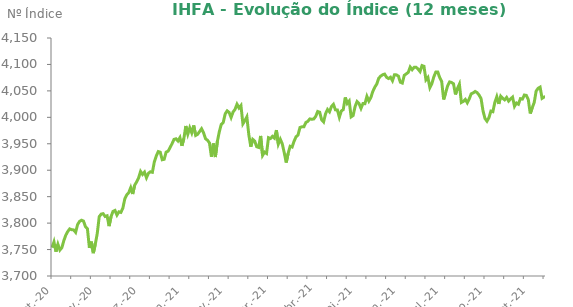
| Category | Series 0 |
|---|---|
| 2020-09-30 | 3753.64 |
| 2020-10-01 | 3764.5 |
| 2020-10-02 | 3745.97 |
| 2020-10-05 | 3760.02 |
| 2020-10-06 | 3748.99 |
| 2020-10-07 | 3753.5 |
| 2020-10-08 | 3766.65 |
| 2020-10-09 | 3777.19 |
| 2020-10-13 | 3784.1 |
| 2020-10-14 | 3789.08 |
| 2020-10-15 | 3787.5 |
| 2020-10-16 | 3787.18 |
| 2020-10-19 | 3782.57 |
| 2020-10-20 | 3797.23 |
| 2020-10-21 | 3803.26 |
| 2020-10-22 | 3805.46 |
| 2020-10-23 | 3803.83 |
| 2020-10-26 | 3793.41 |
| 2020-10-27 | 3789.23 |
| 2020-10-28 | 3753.16 |
| 2020-10-29 | 3765 |
| 2020-10-30 | 3743.2 |
| 2020-11-03 | 3760.2 |
| 2020-11-04 | 3780.52 |
| 2020-11-05 | 3812.25 |
| 2020-11-06 | 3817.11 |
| 2020-11-09 | 3817.77 |
| 2020-11-10 | 3812.47 |
| 2020-11-11 | 3813.86 |
| 2020-11-12 | 3794.28 |
| 2020-11-13 | 3812.36 |
| 2020-11-16 | 3822.16 |
| 2020-11-17 | 3824.03 |
| 2020-11-18 | 3815.25 |
| 2020-11-19 | 3821.41 |
| 2020-11-20 | 3820.26 |
| 2020-11-23 | 3828.39 |
| 2020-11-24 | 3845.88 |
| 2020-11-25 | 3853.47 |
| 2020-11-26 | 3857.65 |
| 2020-11-27 | 3867.12 |
| 2020-11-30 | 3855.05 |
| 2020-12-01 | 3871.75 |
| 2020-12-02 | 3877.88 |
| 2020-12-03 | 3885.5 |
| 2020-12-04 | 3897.62 |
| 2020-12-07 | 3892.04 |
| 2020-12-08 | 3896.42 |
| 2020-12-09 | 3885.78 |
| 2020-12-10 | 3894.3 |
| 2020-12-11 | 3897.04 |
| 2020-12-14 | 3896.11 |
| 2020-12-15 | 3915.91 |
| 2020-12-16 | 3927.07 |
| 2020-12-17 | 3935.34 |
| 2020-12-18 | 3934.05 |
| 2020-12-21 | 3919.86 |
| 2020-12-22 | 3920.69 |
| 2020-12-23 | 3934.3 |
| 2020-12-24 | 3936.01 |
| 2020-12-28 | 3942.95 |
| 2020-12-29 | 3950.19 |
| 2020-12-30 | 3958.34 |
| 2020-12-31 | 3959.42 |
| 2021-01-04 | 3955.28 |
| 2021-01-05 | 3961.68 |
| 2021-01-06 | 3946.08 |
| 2021-01-07 | 3959.91 |
| 2021-01-08 | 3983.61 |
| 2021-01-11 | 3968.18 |
| 2021-01-12 | 3980.22 |
| 2021-01-13 | 3970.68 |
| 2021-01-14 | 3984.72 |
| 2021-01-15 | 3965.79 |
| 2021-01-18 | 3967.89 |
| 2021-01-19 | 3973.23 |
| 2021-01-20 | 3978.48 |
| 2021-01-21 | 3971.03 |
| 2021-01-22 | 3959.66 |
| 2021-01-25 | 3956.69 |
| 2021-01-26 | 3951.66 |
| 2021-01-27 | 3925.52 |
| 2021-01-28 | 3950.5 |
| 2021-01-29 | 3924.94 |
| 2021-02-01 | 3953.82 |
| 2021-02-02 | 3972.6 |
| 2021-02-03 | 3986.69 |
| 2021-02-04 | 3990.2 |
| 2021-02-05 | 4006.56 |
| 2021-02-08 | 4012.28 |
| 2021-02-09 | 4009.25 |
| 2021-02-10 | 3999.73 |
| 2021-02-11 | 4010.06 |
| 2021-02-12 | 4015.12 |
| 2021-02-17 | 4024.82 |
| 2021-02-18 | 4017.66 |
| 2021-02-19 | 4022.34 |
| 2021-02-22 | 3987.76 |
| 2021-02-23 | 3993.76 |
| 2021-02-24 | 4000.86 |
| 2021-02-25 | 3967.23 |
| 2021-02-26 | 3944.47 |
| 2021-03-01 | 3958.31 |
| 2021-03-02 | 3955.07 |
| 2021-03-03 | 3944.44 |
| 2021-03-04 | 3943.1 |
| 2021-03-05 | 3964.81 |
| 2021-03-08 | 3928.07 |
| 2021-03-09 | 3934.21 |
| 2021-03-10 | 3931.67 |
| 2021-03-11 | 3961.52 |
| 2021-03-12 | 3959.95 |
| 2021-03-15 | 3963.95 |
| 2021-03-16 | 3960.68 |
| 2021-03-17 | 3975.84 |
| 2021-03-18 | 3949.49 |
| 2021-03-19 | 3958.61 |
| 2021-03-22 | 3949.93 |
| 2021-03-23 | 3933.15 |
| 2021-03-24 | 3914.5 |
| 2021-03-25 | 3931.89 |
| 2021-03-26 | 3945.28 |
| 2021-03-29 | 3943.87 |
| 2021-03-30 | 3954.78 |
| 2021-03-31 | 3963.24 |
| 2021-04-01 | 3966.52 |
| 2021-04-05 | 3980.85 |
| 2021-04-06 | 3982.14 |
| 2021-04-07 | 3982.23 |
| 2021-04-08 | 3990.34 |
| 2021-04-09 | 3992.5 |
| 2021-04-12 | 3997.03 |
| 2021-04-13 | 3996.38 |
| 2021-04-14 | 3996.89 |
| 2021-04-15 | 4001.89 |
| 2021-04-16 | 4011.06 |
| 2021-04-19 | 4009.7 |
| 2021-04-20 | 3995.43 |
| 2021-04-22 | 3991.36 |
| 2021-04-23 | 4006.88 |
| 2021-04-26 | 4014.86 |
| 2021-04-27 | 4010.42 |
| 2021-04-28 | 4020.49 |
| 2021-04-29 | 4024.6 |
| 2021-04-30 | 4014.13 |
| 2021-05-03 | 4013.92 |
| 2021-05-04 | 4000.09 |
| 2021-05-05 | 4012 |
| 2021-05-06 | 4014.61 |
| 2021-05-07 | 4037.62 |
| 2021-05-10 | 4026.17 |
| 2021-05-11 | 4030.82 |
| 2021-05-12 | 4000.86 |
| 2021-05-13 | 4003.37 |
| 2021-05-14 | 4020.47 |
| 2021-05-17 | 4029.9 |
| 2021-05-18 | 4026.19 |
| 2021-05-19 | 4016.94 |
| 2021-05-20 | 4026.11 |
| 2021-05-21 | 4025.85 |
| 2021-05-24 | 4039.62 |
| 2021-05-25 | 4030.75 |
| 2021-05-26 | 4037.36 |
| 2021-05-27 | 4048.85 |
| 2021-05-28 | 4056.99 |
| 2021-05-31 | 4062.88 |
| 2021-06-01 | 4073.78 |
| 2021-06-02 | 4078.02 |
| 2021-06-04 | 4080.46 |
| 2021-06-07 | 4081.73 |
| 2021-06-08 | 4075.77 |
| 2021-06-09 | 4073.34 |
| 2021-06-10 | 4075.79 |
| 2021-06-11 | 4069.2 |
| 2021-06-14 | 4080.4 |
| 2021-06-15 | 4080.27 |
| 2021-06-16 | 4077.96 |
| 2021-06-17 | 4066.35 |
| 2021-06-18 | 4064.81 |
| 2021-06-21 | 4079.53 |
| 2021-06-22 | 4082.14 |
| 2021-06-23 | 4084.93 |
| 2021-06-24 | 4095.07 |
| 2021-06-25 | 4090.09 |
| 2021-06-28 | 4094.54 |
| 2021-06-29 | 4094.67 |
| 2021-06-30 | 4091.19 |
| 2021-07-01 | 4086.52 |
| 2021-07-02 | 4097.86 |
| 2021-07-05 | 4096.51 |
| 2021-07-06 | 4070.87 |
| 2021-07-07 | 4075.44 |
| 2021-07-08 | 4056.16 |
| 2021-07-09 | 4063.56 |
| 2021-07-12 | 4076.5 |
| 2021-07-13 | 4085.56 |
| 2021-07-14 | 4085.78 |
| 2021-07-15 | 4075.11 |
| 2021-07-16 | 4067.77 |
| 2021-07-19 | 4033.75 |
| 2021-07-20 | 4046.31 |
| 2021-07-21 | 4059.3 |
| 2021-07-22 | 4066.98 |
| 2021-07-23 | 4065.91 |
| 2021-07-26 | 4063.49 |
| 2021-07-27 | 4043.27 |
| 2021-07-28 | 4054.41 |
| 2021-07-29 | 4062.71 |
| 2021-07-30 | 4028.14 |
| 2021-08-02 | 4030.13 |
| 2021-08-03 | 4033.93 |
| 2021-08-04 | 4027.52 |
| 2021-08-05 | 4034.98 |
| 2021-08-06 | 4044.43 |
| 2021-08-09 | 4046.2 |
| 2021-08-10 | 4048.89 |
| 2021-08-11 | 4046.7 |
| 2021-08-12 | 4042.07 |
| 2021-08-13 | 4035.54 |
| 2021-08-16 | 4012.2 |
| 2021-08-17 | 3997.84 |
| 2021-08-18 | 3992.73 |
| 2021-08-19 | 3999.27 |
| 2021-08-20 | 4011.78 |
| 2021-08-23 | 4010.67 |
| 2021-08-24 | 4028.05 |
| 2021-08-25 | 4039.1 |
| 2021-08-26 | 4025.41 |
| 2021-08-27 | 4040.01 |
| 2021-08-30 | 4035.92 |
| 2021-08-31 | 4033.08 |
| 2021-09-01 | 4037.66 |
| 2021-09-02 | 4030.79 |
| 2021-09-03 | 4034.61 |
| 2021-09-06 | 4038.27 |
| 2021-09-08 | 4020.87 |
| 2021-09-09 | 4027.15 |
| 2021-09-10 | 4024.8 |
| 2021-09-13 | 4035.39 |
| 2021-09-14 | 4034.54 |
| 2021-09-15 | 4042.17 |
| 2021-09-16 | 4041.49 |
| 2021-09-17 | 4033.61 |
| 2021-09-20 | 4007.25 |
| 2021-09-21 | 4018.04 |
| 2021-09-22 | 4027.91 |
| 2021-09-23 | 4049.69 |
| 2021-09-24 | 4054.89 |
| 2021-09-27 | 4057.13 |
| 2021-09-28 | 4035.95 |
| 2021-09-29 | 4038.34 |
| 2021-09-30 | 4039.3 |